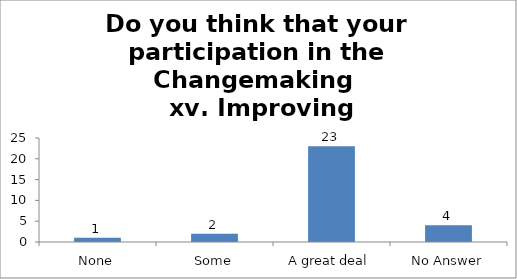
| Category | Do you think that your participation in the Changemaking 
 xv. Improving confidence. |
|---|---|
| None | 1 |
| Some | 2 |
| A great deal | 23 |
| No Answer | 4 |